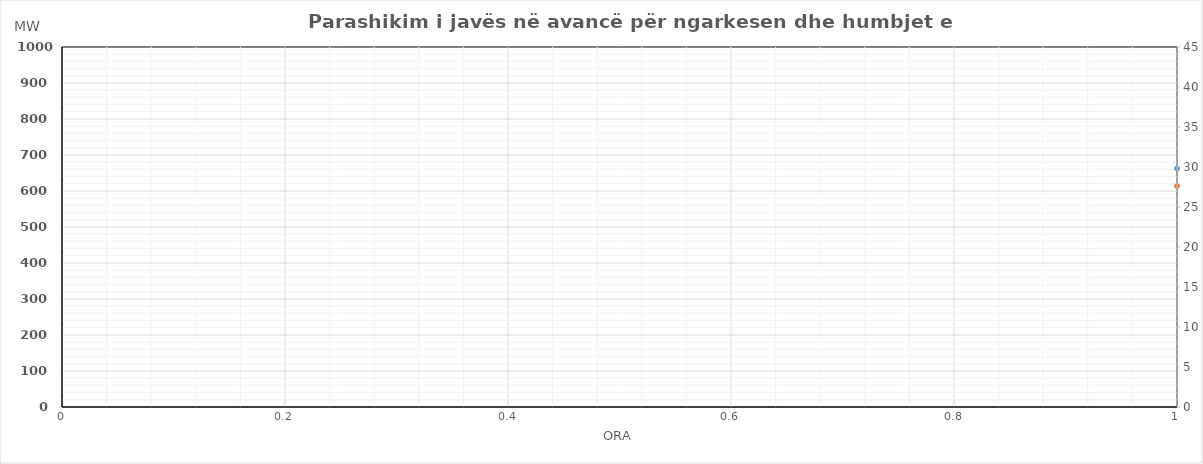
| Category | Ngarkesa (MWh) |
|---|---|
| 0 | 613.778 |
| 1 | 561.688 |
| 2 | 533.635 |
| 3 | 530.05 |
| 4 | 536.912 |
| 5 | 557.548 |
| 6 | 630.558 |
| 7 | 721.784 |
| 8 | 796.276 |
| 9 | 835.713 |
| 10 | 831.787 |
| 11 | 832.153 |
| 12 | 837.714 |
| 13 | 815.654 |
| 14 | 780.801 |
| 15 | 765.837 |
| 16 | 773.279 |
| 17 | 802.32 |
| 18 | 822.861 |
| 19 | 851.571 |
| 20 | 928.598 |
| 21 | 894.329 |
| 22 | 798.312 |
| 23 | 683.682 |
| 24 | 603.356 |
| 25 | 547.81 |
| 26 | 527.114 |
| 27 | 515.958 |
| 28 | 525.436 |
| 29 | 563.601 |
| 30 | 667.143 |
| 31 | 782.87 |
| 32 | 855.77 |
| 33 | 877.098 |
| 34 | 885.137 |
| 35 | 879.097 |
| 36 | 867.313 |
| 37 | 864.277 |
| 38 | 831.519 |
| 39 | 811.304 |
| 40 | 798.427 |
| 41 | 817.972 |
| 42 | 833.521 |
| 43 | 848.91 |
| 44 | 902.458 |
| 45 | 859.461 |
| 46 | 764.428 |
| 47 | 662.069 |
| 48 | 598.577 |
| 49 | 551.663 |
| 50 | 538.883 |
| 51 | 529.273 |
| 52 | 528.985 |
| 53 | 564.917 |
| 54 | 651.597 |
| 55 | 793.645 |
| 56 | 822.323 |
| 57 | 813.26 |
| 58 | 797.245 |
| 59 | 795.813 |
| 60 | 793.752 |
| 61 | 804.03 |
| 62 | 789.372 |
| 63 | 775.521 |
| 64 | 769.372 |
| 65 | 783.004 |
| 66 | 806.18 |
| 67 | 823.287 |
| 68 | 903.421 |
| 69 | 864.319 |
| 70 | 793.292 |
| 71 | 687.819 |
| 72 | 605.075 |
| 73 | 546.207 |
| 74 | 530.718 |
| 75 | 527.341 |
| 76 | 535.666 |
| 77 | 576.41 |
| 78 | 673.414 |
| 79 | 794.543 |
| 80 | 833.646 |
| 81 | 818.441 |
| 82 | 805.125 |
| 83 | 798.612 |
| 84 | 791.096 |
| 85 | 790.341 |
| 86 | 778.191 |
| 87 | 758.411 |
| 88 | 755.279 |
| 89 | 779.57 |
| 90 | 798.516 |
| 91 | 813.173 |
| 92 | 898.878 |
| 93 | 862.828 |
| 94 | 798.571 |
| 95 | 680.614 |
| 96 | 600.577 |
| 97 | 553.663 |
| 98 | 540.883 |
| 99 | 531.273 |
| 100 | 530.985 |
| 101 | 566.917 |
| 102 | 653.597 |
| 103 | 795.645 |
| 104 | 824.323 |
| 105 | 815.26 |
| 106 | 799.245 |
| 107 | 797.813 |
| 108 | 795.752 |
| 109 | 806.03 |
| 110 | 791.372 |
| 111 | 777.521 |
| 112 | 771.372 |
| 113 | 785.004 |
| 114 | 808.18 |
| 115 | 825.287 |
| 116 | 905.421 |
| 117 | 866.319 |
| 118 | 795.292 |
| 119 | 689.819 |
| 120 | 615.778 |
| 121 | 563.688 |
| 122 | 535.635 |
| 123 | 532.05 |
| 124 | 538.912 |
| 125 | 559.548 |
| 126 | 632.558 |
| 127 | 723.784 |
| 128 | 798.276 |
| 129 | 837.713 |
| 130 | 833.787 |
| 131 | 834.153 |
| 132 | 839.714 |
| 133 | 817.654 |
| 134 | 782.801 |
| 135 | 767.837 |
| 136 | 775.279 |
| 137 | 804.32 |
| 138 | 824.861 |
| 139 | 853.571 |
| 140 | 930.598 |
| 141 | 896.329 |
| 142 | 800.312 |
| 143 | 685.682 |
| 144 | 599.577 |
| 145 | 552.663 |
| 146 | 539.883 |
| 147 | 530.273 |
| 148 | 529.985 |
| 149 | 565.917 |
| 150 | 652.597 |
| 151 | 794.645 |
| 152 | 823.323 |
| 153 | 814.26 |
| 154 | 798.245 |
| 155 | 796.813 |
| 156 | 794.752 |
| 157 | 805.03 |
| 158 | 790.372 |
| 159 | 776.521 |
| 160 | 770.372 |
| 161 | 784.004 |
| 162 | 807.18 |
| 163 | 824.287 |
| 164 | 904.421 |
| 165 | 865.319 |
| 166 | 794.292 |
| 167 | 688.819 |